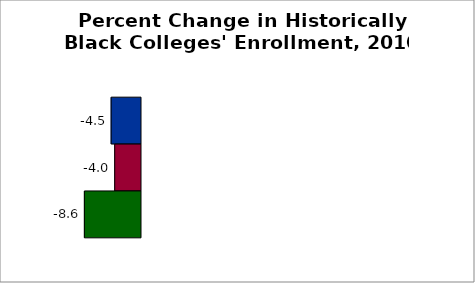
| Category | 50 states and D.C. | SREB states | State |
|---|---|---|---|
| 2012 to 2017 | -4.517 | -3.968 | -8.633 |